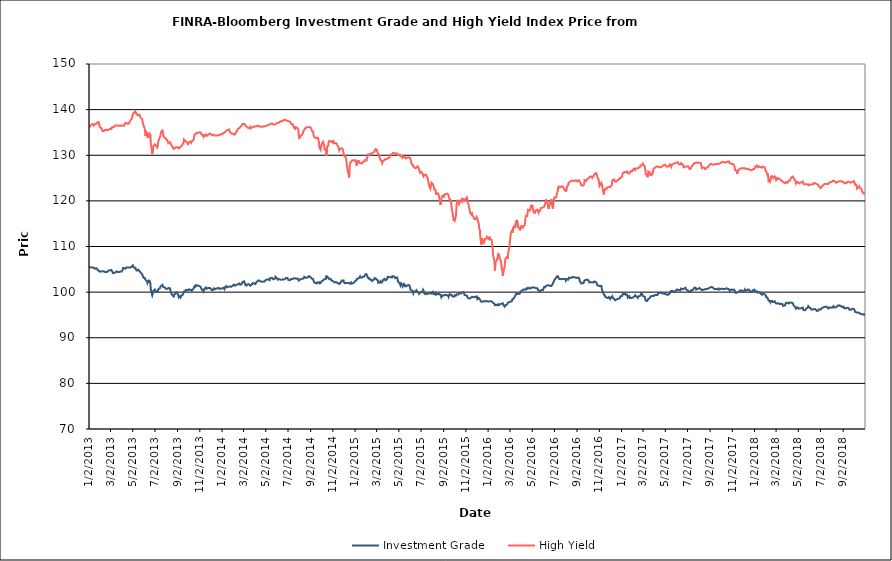
| Category | Investment Grade | High Yield |
|---|---|---|
| 1/2/13 | 105.494 | 136.004 |
| 1/3/13 | 105.419 | 136.223 |
| 1/4/13 | 105.349 | 136.418 |
| 1/7/13 | 105.428 | 136.539 |
| 1/8/13 | 105.485 | 136.567 |
| 1/9/13 | 105.45 | 136.666 |
| 1/10/13 | 105.382 | 136.791 |
| 1/11/13 | 105.347 | 136.887 |
| 1/14/13 | 105.372 | 136.76 |
| 1/15/13 | 105.348 | 136.538 |
| 1/16/13 | 105.332 | 136.64 |
| 1/17/13 | 105.127 | 136.744 |
| 1/18/13 | 105.195 | 136.872 |
| 1/22/13 | 105.239 | 136.901 |
| 1/23/13 | 105.259 | 137.065 |
| 1/24/13 | 105.154 | 137.18 |
| 1/25/13 | 104.918 | 137.344 |
| 1/28/13 | 104.671 | 137.292 |
| 1/29/13 | 104.628 | 136.915 |
| 1/30/13 | 104.462 | 136.633 |
| 1/31/13 | 104.489 | 136.183 |
| 2/1/13 | 104.509 | 136.3 |
| 2/4/13 | 104.516 | 135.996 |
| 2/5/13 | 104.38 | 135.778 |
| 2/6/13 | 104.452 | 135.607 |
| 2/7/13 | 104.557 | 135.447 |
| 2/8/13 | 104.482 | 135.313 |
| 2/11/13 | 104.548 | 135.322 |
| 2/12/13 | 104.435 | 135.393 |
| 2/13/13 | 104.331 | 135.446 |
| 2/14/13 | 104.432 | 135.524 |
| 2/15/13 | 104.394 | 135.504 |
| 2/19/13 | 104.387 | 135.572 |
| 2/20/13 | 104.348 | 135.627 |
| 2/21/13 | 104.499 | 135.402 |
| 2/22/13 | 104.557 | 135.485 |
| 2/25/13 | 104.756 | 135.664 |
| 2/26/13 | 104.841 | 135.55 |
| 2/27/13 | 104.778 | 135.597 |
| 2/28/13 | 104.777 | 135.799 |
| 3/1/13 | 104.858 | 135.684 |
| 3/4/13 | 104.85 | 135.753 |
| 3/5/13 | 104.754 | 136.111 |
| 3/6/13 | 104.599 | 136.122 |
| 3/7/13 | 104.412 | 136.133 |
| 3/8/13 | 104.18 | 136.117 |
| 3/11/13 | 104.184 | 136.2 |
| 3/12/13 | 104.331 | 136.304 |
| 3/13/13 | 104.278 | 136.283 |
| 3/14/13 | 104.276 | 136.504 |
| 3/15/13 | 104.401 | 136.543 |
| 3/18/13 | 104.535 | 136.549 |
| 3/19/13 | 104.67 | 136.561 |
| 3/20/13 | 104.466 | 136.574 |
| 3/21/13 | 104.428 | 136.487 |
| 3/22/13 | 104.404 | 136.502 |
| 3/25/13 | 104.386 | 136.448 |
| 3/26/13 | 104.316 | 136.408 |
| 3/27/13 | 104.488 | 136.442 |
| 3/28/13 | 104.489 | 136.483 |
| 4/1/13 | 104.516 | 136.479 |
| 4/2/13 | 104.463 | 136.55 |
| 4/3/13 | 104.642 | 136.537 |
| 4/4/13 | 104.92 | 136.53 |
| 4/5/13 | 105.293 | 136.496 |
| 4/8/13 | 105.29 | 136.464 |
| 4/9/13 | 105.304 | 136.717 |
| 4/10/13 | 105.125 | 136.822 |
| 4/11/13 | 105.12 | 137.05 |
| 4/12/13 | 105.316 | 137.192 |
| 4/15/13 | 105.424 | 137.038 |
| 4/16/13 | 105.369 | 137.111 |
| 4/17/13 | 105.389 | 136.936 |
| 4/18/13 | 105.407 | 136.862 |
| 4/19/13 | 105.346 | 136.955 |
| 4/22/13 | 105.406 | 137.056 |
| 4/23/13 | 105.46 | 137.317 |
| 4/24/13 | 105.498 | 137.459 |
| 4/25/13 | 105.38 | 137.639 |
| 4/26/13 | 105.595 | 137.856 |
| 4/29/13 | 105.615 | 138.038 |
| 4/30/13 | 105.612 | 138.388 |
| 5/1/13 | 105.781 | 138.733 |
| 5/2/13 | 105.844 | 138.955 |
| 5/3/13 | 105.494 | 139.201 |
| 5/6/13 | 105.353 | 139.261 |
| 5/7/13 | 105.329 | 139.46 |
| 5/8/13 | 105.359 | 139.652 |
| 5/9/13 | 105.342 | 139.604 |
| 5/10/13 | 104.923 | 139.359 |
| 5/13/13 | 104.727 | 138.947 |
| 5/14/13 | 104.694 | 138.789 |
| 5/15/13 | 104.673 | 138.724 |
| 5/16/13 | 104.927 | 138.831 |
| 5/17/13 | 104.738 | 138.852 |
| 5/20/13 | 104.621 | 138.896 |
| 5/21/13 | 104.661 | 138.85 |
| 5/22/13 | 104.462 | 138.759 |
| 5/23/13 | 104.301 | 138.269 |
| 5/24/13 | 104.298 | 138.075 |
| 5/28/13 | 103.825 | 137.844 |
| 5/29/13 | 103.525 | 137.043 |
| 5/30/13 | 103.475 | 136.973 |
| 5/31/13 | 103.159 | 136.601 |
| 6/3/13 | 103.169 | 135.944 |
| 6/4/13 | 102.987 | 135.582 |
| 6/5/13 | 102.781 | 134.538 |
| 6/6/13 | 102.788 | 134.224 |
| 6/7/13 | 102.678 | 135.191 |
| 6/10/13 | 102.314 | 134.939 |
| 6/11/13 | 101.98 | 133.85 |
| 6/12/13 | 102.018 | 134.087 |
| 6/13/13 | 102.11 | 133.805 |
| 6/14/13 | 102.545 | 134.401 |
| 6/17/13 | 102.474 | 134.746 |
| 6/18/13 | 102.164 | 134.589 |
| 6/19/13 | 101.914 | 134.457 |
| 6/20/13 | 100.588 | 132.485 |
| 6/21/13 | 100.219 | 132.116 |
| 6/24/13 | 99.311 | 130.267 |
| 6/25/13 | 99.469 | 130.422 |
| 6/26/13 | 99.857 | 131.058 |
| 6/27/13 | 100.266 | 131.995 |
| 6/28/13 | 100.357 | 132.199 |
| 7/1/13 | 100.575 | 132.38 |
| 7/2/13 | 100.774 | 132.5 |
| 7/3/13 | 100.789 | 132.233 |
| 7/5/13 | 100.052 | 132.062 |
| 7/8/13 | 100.063 | 131.702 |
| 7/9/13 | 100.261 | 131.99 |
| 7/10/13 | 100.23 | 132.194 |
| 7/11/13 | 100.65 | 133.132 |
| 7/12/13 | 100.778 | 133.422 |
| 7/15/13 | 100.866 | 133.956 |
| 7/16/13 | 101.036 | 134.184 |
| 7/17/13 | 101.286 | 134.476 |
| 7/18/13 | 101.274 | 135.077 |
| 7/19/13 | 101.435 | 135.209 |
| 7/22/13 | 101.6 | 135.45 |
| 7/23/13 | 101.546 | 135.437 |
| 7/24/13 | 101.125 | 134.763 |
| 7/25/13 | 100.927 | 134.065 |
| 7/26/13 | 101.109 | 134.013 |
| 7/29/13 | 101.003 | 133.854 |
| 7/30/13 | 100.974 | 133.888 |
| 7/31/13 | 100.761 | 133.596 |
| 8/1/13 | 100.577 | 133.583 |
| 8/2/13 | 100.839 | 133.403 |
| 8/5/13 | 100.724 | 133.206 |
| 8/6/13 | 100.666 | 132.905 |
| 8/7/13 | 100.771 | 132.644 |
| 8/8/13 | 100.906 | 132.743 |
| 8/9/13 | 100.882 | 132.811 |
| 8/12/13 | 100.814 | 132.845 |
| 8/13/13 | 100.327 | 132.628 |
| 8/14/13 | 100.232 | 132.676 |
| 8/15/13 | 99.756 | 132.339 |
| 8/16/13 | 99.565 | 132.204 |
| 8/19/13 | 99.254 | 131.767 |
| 8/20/13 | 99.406 | 131.634 |
| 8/21/13 | 99.234 | 131.571 |
| 8/22/13 | 99.051 | 131.404 |
| 8/23/13 | 99.367 | 131.617 |
| 8/26/13 | 99.636 | 131.681 |
| 8/27/13 | 99.89 | 131.589 |
| 8/28/13 | 99.751 | 131.599 |
| 8/29/13 | 99.819 | 131.721 |
| 8/30/13 | 99.969 | 131.931 |
| 9/3/13 | 99.443 | 131.767 |
| 9/4/13 | 99.4 | 131.735 |
| 9/5/13 | 98.833 | 131.503 |
| 9/6/13 | 99.036 | 131.534 |
| 9/9/13 | 99.126 | 131.762 |
| 9/10/13 | 98.881 | 131.688 |
| 9/11/13 | 98.985 | 131.774 |
| 9/12/13 | 99.199 | 132.012 |
| 9/13/13 | 99.132 | 132.108 |
| 9/16/13 | 99.445 | 132.49 |
| 9/17/13 | 99.387 | 132.526 |
| 9/18/13 | 99.587 | 132.801 |
| 9/19/13 | 100.13 | 133.454 |
| 9/20/13 | 100.145 | 133.463 |
| 9/23/13 | 100.222 | 133.158 |
| 9/24/13 | 100.458 | 133.178 |
| 9/25/13 | 100.57 | 133.037 |
| 9/26/13 | 100.459 | 132.947 |
| 9/27/13 | 100.477 | 132.761 |
| 9/30/13 | 100.36 | 132.403 |
| 10/1/13 | 100.351 | 132.559 |
| 10/2/13 | 100.5 | 132.65 |
| 10/3/13 | 100.614 | 132.895 |
| 10/4/13 | 100.436 | 132.974 |
| 10/7/13 | 100.499 | 133.004 |
| 10/8/13 | 100.458 | 132.84 |
| 10/9/13 | 100.359 | 132.765 |
| 10/10/13 | 100.309 | 133.012 |
| 10/11/13 | 100.536 | 133.183 |
| 10/14/13 | 100.578 | 133.263 |
| 10/15/13 | 100.404 | 133.285 |
| 10/16/13 | 100.541 | 133.539 |
| 10/17/13 | 101.066 | 134.085 |
| 10/18/13 | 101.3 | 134.484 |
| 10/21/13 | 101.202 | 134.622 |
| 10/22/13 | 101.507 | 134.843 |
| 10/23/13 | 101.575 | 134.752 |
| 10/24/13 | 101.454 | 134.8 |
| 10/25/13 | 101.475 | 134.836 |
| 10/28/13 | 101.432 | 134.984 |
| 10/29/13 | 101.425 | 134.988 |
| 10/30/13 | 101.524 | 135.037 |
| 10/31/13 | 101.352 | 135.022 |
| 11/1/13 | 101.143 | 134.905 |
| 11/4/13 | 101.125 | 135.008 |
| 11/5/13 | 100.846 | 134.753 |
| 11/6/13 | 100.906 | 134.761 |
| 11/7/13 | 100.99 | 134.746 |
| 11/8/13 | 100.473 | 134.373 |
| 11/11/13 | 100.506 | 134.437 |
| 11/12/13 | 100.257 | 134.002 |
| 11/13/13 | 100.423 | 133.829 |
| 11/14/13 | 100.717 | 134.11 |
| 11/15/13 | 100.772 | 134.271 |
| 11/18/13 | 101.031 | 134.561 |
| 11/19/13 | 100.928 | 134.495 |
| 11/20/13 | 100.749 | 134.418 |
| 11/21/13 | 100.578 | 134.251 |
| 11/22/13 | 100.784 | 134.462 |
| 11/25/13 | 100.926 | 134.532 |
| 11/26/13 | 101.066 | 134.489 |
| 11/27/13 | 100.968 | 134.694 |
| 11/29/13 | 100.926 | 134.769 |
| 12/2/13 | 100.715 | 134.59 |
| 12/3/13 | 100.783 | 134.592 |
| 12/4/13 | 100.522 | 134.448 |
| 12/5/13 | 100.422 | 134.378 |
| 12/6/13 | 100.434 | 134.486 |
| 12/9/13 | 100.55 | 134.531 |
| 12/10/13 | 100.804 | 134.606 |
| 12/11/13 | 100.783 | 134.549 |
| 12/12/13 | 100.616 | 134.316 |
| 12/13/13 | 100.656 | 134.34 |
| 12/16/13 | 100.77 | 134.355 |
| 12/17/13 | 100.883 | 134.318 |
| 12/18/13 | 100.862 | 134.256 |
| 12/19/13 | 100.784 | 134.28 |
| 12/20/13 | 100.91 | 134.382 |
| 12/23/13 | 100.94 | 134.459 |
| 12/24/13 | 100.826 | 134.433 |
| 12/26/13 | 100.715 | 134.462 |
| 12/27/13 | 100.661 | 134.544 |
| 12/30/13 | 100.78 | 134.644 |
| 12/31/13 | 100.835 | 134.665 |
| 1/2/14 | 100.818 | 134.61 |
| 1/3/14 | 100.821 | 134.675 |
| 1/6/14 | 100.947 | 134.841 |
| 1/7/14 | 100.979 | 135.053 |
| 1/8/14 | 100.662 | 135.04 |
| 1/9/14 | 100.703 | 135.072 |
| 1/10/14 | 101.104 | 135.228 |
| 1/13/14 | 101.302 | 135.332 |
| 1/14/14 | 101.168 | 135.33 |
| 1/15/14 | 101.05 | 135.493 |
| 1/16/14 | 101.186 | 135.513 |
| 1/17/14 | 101.214 | 135.694 |
| 1/21/14 | 101.237 | 135.657 |
| 1/22/14 | 101.077 | 135.696 |
| 1/23/14 | 101.165 | 135.526 |
| 1/24/14 | 101.225 | 135.025 |
| 1/27/14 | 101.165 | 134.766 |
| 1/28/14 | 101.185 | 134.798 |
| 1/29/14 | 101.336 | 134.736 |
| 1/30/14 | 101.366 | 134.782 |
| 1/31/14 | 101.431 | 134.664 |
| 2/3/14 | 101.636 | 134.541 |
| 2/4/14 | 101.583 | 134.457 |
| 2/5/14 | 101.42 | 134.361 |
| 2/6/14 | 101.393 | 134.536 |
| 2/7/14 | 101.592 | 134.888 |
| 2/10/14 | 101.615 | 135.076 |
| 2/11/14 | 101.498 | 135.216 |
| 2/12/14 | 101.418 | 135.441 |
| 2/13/14 | 101.69 | 135.543 |
| 2/14/14 | 101.753 | 135.746 |
| 2/18/14 | 101.892 | 135.952 |
| 2/19/14 | 101.879 | 136.044 |
| 2/20/14 | 101.613 | 136.097 |
| 2/21/14 | 101.699 | 136.258 |
| 2/24/14 | 101.732 | 136.482 |
| 2/25/14 | 101.989 | 136.691 |
| 2/26/14 | 102.079 | 136.809 |
| 2/27/14 | 102.222 | 136.918 |
| 2/28/14 | 102.211 | 137.009 |
| 3/3/14 | 102.364 | 136.884 |
| 3/4/14 | 102.118 | 136.915 |
| 3/5/14 | 102.048 | 136.916 |
| 3/6/14 | 101.816 | 136.684 |
| 3/7/14 | 101.497 | 136.459 |
| 3/10/14 | 101.461 | 136.253 |
| 3/11/14 | 101.46 | 136.252 |
| 3/12/14 | 101.557 | 136.142 |
| 3/13/14 | 101.718 | 136.026 |
| 3/14/14 | 101.769 | 135.809 |
| 3/17/14 | 101.717 | 135.965 |
| 3/18/14 | 101.749 | 136.072 |
| 3/19/14 | 101.649 | 136.191 |
| 3/20/14 | 101.412 | 135.875 |
| 3/21/14 | 101.566 | 136.086 |
| 3/24/14 | 101.667 | 136.015 |
| 3/25/14 | 101.737 | 136.04 |
| 3/26/14 | 101.878 | 136.252 |
| 3/27/14 | 101.987 | 136.119 |
| 3/28/14 | 101.878 | 136.233 |
| 3/31/14 | 101.852 | 136.266 |
| 4/1/14 | 101.868 | 136.261 |
| 4/2/14 | 101.643 | 136.321 |
| 4/3/14 | 101.764 | 136.337 |
| 4/4/14 | 102.025 | 136.448 |
| 4/7/14 | 102.21 | 136.349 |
| 4/8/14 | 102.242 | 136.393 |
| 4/9/14 | 102.266 | 136.486 |
| 4/10/14 | 102.532 | 136.521 |
| 4/11/14 | 102.573 | 136.311 |
| 4/14/14 | 102.531 | 136.308 |
| 4/15/14 | 102.544 | 136.227 |
| 4/16/14 | 102.487 | 136.253 |
| 4/17/14 | 102.346 | 136.257 |
| 4/21/14 | 102.277 | 136.247 |
| 4/22/14 | 102.207 | 136.279 |
| 4/23/14 | 102.343 | 136.332 |
| 4/24/14 | 102.303 | 136.334 |
| 4/25/14 | 102.421 | 136.355 |
| 4/28/14 | 102.328 | 136.308 |
| 4/29/14 | 102.243 | 136.341 |
| 4/30/14 | 102.413 | 136.464 |
| 5/1/14 | 102.654 | 136.42 |
| 5/2/14 | 102.735 | 136.585 |
| 5/5/14 | 102.752 | 136.518 |
| 5/6/14 | 102.75 | 136.554 |
| 5/7/14 | 102.757 | 136.59 |
| 5/8/14 | 102.825 | 136.629 |
| 5/9/14 | 102.765 | 136.738 |
| 5/12/14 | 102.608 | 136.757 |
| 5/13/14 | 102.76 | 136.86 |
| 5/14/14 | 103.095 | 136.951 |
| 5/15/14 | 103.233 | 136.892 |
| 5/16/14 | 103.154 | 136.848 |
| 5/19/14 | 103.118 | 136.968 |
| 5/20/14 | 103.068 | 136.874 |
| 5/21/14 | 102.909 | 136.849 |
| 5/22/14 | 102.817 | 136.739 |
| 5/23/14 | 102.956 | 136.771 |
| 5/27/14 | 102.996 | 136.726 |
| 5/28/14 | 103.368 | 136.78 |
| 5/29/14 | 103.4 | 136.844 |
| 5/30/14 | 103.25 | 136.989 |
| 6/2/14 | 102.997 | 137.03 |
| 6/3/14 | 102.747 | 136.843 |
| 6/4/14 | 102.639 | 136.861 |
| 6/5/14 | 102.724 | 137.095 |
| 6/6/14 | 102.858 | 137.239 |
| 6/9/14 | 102.774 | 137.321 |
| 6/10/14 | 102.652 | 137.409 |
| 6/11/14 | 102.666 | 137.46 |
| 6/12/14 | 102.706 | 137.448 |
| 6/13/14 | 102.744 | 137.427 |
| 6/16/14 | 102.763 | 137.473 |
| 6/17/14 | 102.566 | 137.403 |
| 6/18/14 | 102.647 | 137.424 |
| 6/19/14 | 102.775 | 137.698 |
| 6/20/14 | 102.697 | 137.723 |
| 6/23/14 | 102.846 | 137.779 |
| 6/24/14 | 102.88 | 137.797 |
| 6/25/14 | 103.059 | 137.699 |
| 6/26/14 | 103.117 | 137.613 |
| 6/27/14 | 103.111 | 137.582 |
| 6/30/14 | 103.096 | 137.543 |
| 7/1/14 | 102.92 | 137.521 |
| 7/2/14 | 102.692 | 137.487 |
| 7/3/14 | 102.53 | 137.445 |
| 7/7/14 | 102.607 | 137.369 |
| 7/8/14 | 102.82 | 137.259 |
| 7/9/14 | 102.778 | 137.102 |
| 7/10/14 | 102.892 | 136.873 |
| 7/11/14 | 102.97 | 136.858 |
| 7/14/14 | 102.883 | 136.783 |
| 7/15/14 | 102.808 | 136.662 |
| 7/16/14 | 102.837 | 136.489 |
| 7/17/14 | 103.023 | 136.093 |
| 7/18/14 | 102.976 | 135.884 |
| 7/21/14 | 103.018 | 135.786 |
| 7/22/14 | 103.027 | 135.911 |
| 7/23/14 | 103.133 | 136.146 |
| 7/24/14 | 102.926 | 136.135 |
| 7/25/14 | 103.053 | 136.103 |
| 7/28/14 | 103.005 | 135.916 |
| 7/29/14 | 103.084 | 135.842 |
| 7/30/14 | 102.775 | 135.555 |
| 7/31/14 | 102.536 | 134.442 |
| 8/1/14 | 102.65 | 133.751 |
| 8/4/14 | 102.794 | 133.906 |
| 8/5/14 | 102.693 | 134.262 |
| 8/6/14 | 102.743 | 134.202 |
| 8/7/14 | 102.903 | 134.308 |
| 8/8/14 | 103.015 | 134.39 |
| 8/11/14 | 102.911 | 134.76 |
| 8/12/14 | 102.848 | 134.962 |
| 8/13/14 | 102.947 | 135.352 |
| 8/14/14 | 103.093 | 135.465 |
| 8/15/14 | 103.336 | 135.579 |
| 8/18/14 | 103.224 | 135.868 |
| 8/19/14 | 103.166 | 136.06 |
| 8/20/14 | 103.049 | 136.102 |
| 8/21/14 | 103.116 | 136.129 |
| 8/22/14 | 103.16 | 136.109 |
| 8/25/14 | 103.266 | 136.118 |
| 8/26/14 | 103.305 | 136.212 |
| 8/27/14 | 103.386 | 136.164 |
| 8/28/14 | 103.533 | 136.214 |
| 8/29/14 | 103.569 | 136.23 |
| 9/2/14 | 103.224 | 136.057 |
| 9/3/14 | 103.152 | 135.89 |
| 9/4/14 | 102.992 | 135.641 |
| 9/5/14 | 102.979 | 135.338 |
| 9/8/14 | 102.91 | 135.188 |
| 9/9/14 | 102.636 | 134.826 |
| 9/10/14 | 102.415 | 134.318 |
| 9/11/14 | 102.404 | 134.077 |
| 9/12/14 | 102.066 | 133.947 |
| 9/15/14 | 102.058 | 133.746 |
| 9/16/14 | 102.079 | 133.58 |
| 9/17/14 | 102.06 | 133.729 |
| 9/18/14 | 101.895 | 133.842 |
| 9/19/14 | 102.051 | 133.984 |
| 9/22/14 | 102.194 | 133.817 |
| 9/23/14 | 102.265 | 133.321 |
| 9/24/14 | 102.135 | 133.064 |
| 9/25/14 | 102.162 | 132.238 |
| 9/26/14 | 101.911 | 131.656 |
| 9/29/14 | 101.987 | 131.223 |
| 9/30/14 | 101.995 | 131.89 |
| 10/1/14 | 102.349 | 132.149 |
| 10/2/14 | 102.373 | 132.201 |
| 10/3/14 | 102.345 | 132.64 |
| 10/6/14 | 102.56 | 132.946 |
| 10/7/14 | 102.76 | 132.603 |
| 10/8/14 | 102.816 | 132.383 |
| 10/9/14 | 102.873 | 131.878 |
| 10/10/14 | 102.843 | 131.266 |
| 10/13/14 | 102.861 | 131.314 |
| 10/14/14 | 103.153 | 130.54 |
| 10/15/14 | 103.63 | 129.86 |
| 10/16/14 | 103.21 | 130.301 |
| 10/17/14 | 103.149 | 132.001 |
| 10/20/14 | 103.206 | 132.057 |
| 10/21/14 | 103.156 | 132.922 |
| 10/22/14 | 103.063 | 133.044 |
| 10/23/14 | 102.823 | 133.165 |
| 10/24/14 | 102.843 | 133.183 |
| 10/27/14 | 102.852 | 132.995 |
| 10/28/14 | 102.764 | 133.102 |
| 10/29/14 | 102.545 | 132.948 |
| 10/30/14 | 102.596 | 132.859 |
| 10/31/14 | 102.445 | 133.107 |
| 11/3/14 | 102.344 | 133.133 |
| 11/4/14 | 102.35 | 132.642 |
| 11/5/14 | 102.221 | 132.701 |
| 11/6/14 | 102.127 | 132.705 |
| 11/7/14 | 102.255 | 132.638 |
| 11/10/14 | 102.218 | 132.691 |
| 11/11/14 | 102.225 | 132.81 |
| 11/12/14 | 102.112 | 132.619 |
| 11/13/14 | 102.052 | 132.412 |
| 11/14/14 | 102.008 | 132.145 |
| 11/17/14 | 101.894 | 131.772 |
| 11/18/14 | 101.843 | 131.427 |
| 11/19/14 | 101.695 | 131.083 |
| 11/20/14 | 101.809 | 131.09 |
| 11/21/14 | 102.03 | 131.414 |
| 11/24/14 | 102.171 | 131.531 |
| 11/25/14 | 102.338 | 131.588 |
| 11/26/14 | 102.539 | 131.644 |
| 11/28/14 | 102.655 | 131.425 |
| 12/1/14 | 102.559 | 130.466 |
| 12/2/14 | 102.141 | 129.983 |
| 12/3/14 | 102.081 | 130.038 |
| 12/4/14 | 102.177 | 129.993 |
| 12/5/14 | 101.947 | 129.782 |
| 12/8/14 | 101.994 | 129.233 |
| 12/9/14 | 102.101 | 128.353 |
| 12/10/14 | 102.099 | 127.663 |
| 12/11/14 | 102.021 | 127.356 |
| 12/12/14 | 102.212 | 126.57 |
| 12/15/14 | 101.978 | 125.84 |
| 12/16/14 | 101.885 | 125.12 |
| 12/17/14 | 101.994 | 126.235 |
| 12/18/14 | 101.843 | 127.8 |
| 12/19/14 | 102.027 | 128.272 |
| 12/22/14 | 102.137 | 128.584 |
| 12/23/14 | 102.011 | 128.794 |
| 12/24/14 | 101.848 | 128.833 |
| 12/26/14 | 101.905 | 128.825 |
| 12/29/14 | 102.054 | 128.921 |
| 12/30/14 | 102.239 | 128.765 |
| 12/31/14 | 102.233 | 128.769 |
| 1/2/15 | 102.426 | 128.911 |
| 1/5/15 | 102.586 | 128.223 |
| 1/6/15 | 102.878 | 127.662 |
| 1/7/15 | 102.893 | 128.095 |
| 1/8/15 | 102.797 | 128.789 |
| 1/9/15 | 102.956 | 128.868 |
| 1/12/15 | 103.094 | 128.728 |
| 1/13/15 | 103.116 | 128.583 |
| 1/14/15 | 103.282 | 128.28 |
| 1/15/15 | 103.445 | 128.444 |
| 1/16/15 | 103.218 | 128.331 |
| 1/20/15 | 103.176 | 128.203 |
| 1/21/15 | 103.074 | 128.203 |
| 1/22/15 | 102.998 | 128.455 |
| 1/23/15 | 103.395 | 128.628 |
| 1/26/15 | 103.388 | 128.595 |
| 1/27/15 | 103.486 | 128.767 |
| 1/28/15 | 103.616 | 128.923 |
| 1/29/15 | 103.575 | 128.896 |
| 1/30/15 | 103.915 | 128.884 |
| 2/2/15 | 103.902 | 128.826 |
| 2/3/15 | 103.611 | 129.307 |
| 2/4/15 | 103.464 | 129.573 |
| 2/5/15 | 103.571 | 129.826 |
| 2/6/15 | 103.134 | 130.204 |
| 2/9/15 | 103.034 | 130.169 |
| 2/10/15 | 102.809 | 130.199 |
| 2/11/15 | 102.739 | 130.053 |
| 2/12/15 | 102.846 | 130.105 |
| 2/13/15 | 102.803 | 130.334 |
| 2/17/15 | 102.437 | 130.465 |
| 2/18/15 | 102.543 | 130.673 |
| 2/19/15 | 102.623 | 130.581 |
| 2/20/15 | 102.701 | 130.602 |
| 2/23/15 | 102.76 | 130.717 |
| 2/24/15 | 103.054 | 130.904 |
| 2/25/15 | 103.205 | 131.093 |
| 2/26/15 | 103.084 | 131.259 |
| 2/27/15 | 103.014 | 131.346 |
| 3/2/15 | 102.766 | 131.232 |
| 3/3/15 | 102.641 | 131.019 |
| 3/4/15 | 102.55 | 130.662 |
| 3/5/15 | 102.571 | 130.64 |
| 3/6/15 | 102.05 | 130.229 |
| 3/9/15 | 102.107 | 129.958 |
| 3/10/15 | 102.236 | 129.348 |
| 3/11/15 | 102.218 | 129.308 |
| 3/12/15 | 102.373 | 129.437 |
| 3/13/15 | 102.12 | 128.915 |
| 3/16/15 | 102.092 | 128.692 |
| 3/17/15 | 102.088 | 128.301 |
| 3/18/15 | 102.392 | 128.399 |
| 3/19/15 | 102.637 | 128.765 |
| 3/20/15 | 102.778 | 128.818 |
| 3/23/15 | 102.9 | 128.891 |
| 3/24/15 | 103.067 | 129.136 |
| 3/25/15 | 102.948 | 129.155 |
| 3/26/15 | 102.572 | 129.012 |
| 3/27/15 | 102.722 | 129.135 |
| 3/30/15 | 102.816 | 129.18 |
| 3/31/15 | 102.97 | 129.203 |
| 4/1/15 | 103.346 | 129.242 |
| 4/2/15 | 103.283 | 129.384 |
| 4/6/15 | 103.281 | 129.514 |
| 4/7/15 | 103.339 | 129.813 |
| 4/8/15 | 103.385 | 130.12 |
| 4/9/15 | 103.25 | 130.08 |
| 4/10/15 | 103.269 | 130.183 |
| 4/13/15 | 103.225 | 130.222 |
| 4/14/15 | 103.502 | 130.217 |
| 4/15/15 | 103.476 | 130.43 |
| 4/16/15 | 103.412 | 130.52 |
| 4/17/15 | 103.448 | 130.393 |
| 4/20/15 | 103.374 | 130.451 |
| 4/21/15 | 103.344 | 130.415 |
| 4/22/15 | 103.073 | 130.258 |
| 4/23/15 | 103.075 | 130.272 |
| 4/24/15 | 103.252 | 130.37 |
| 4/27/15 | 103.2 | 130.372 |
| 4/28/15 | 102.95 | 130.305 |
| 4/29/15 | 102.411 | 130.069 |
| 4/30/15 | 102.251 | 129.999 |
| 5/1/15 | 102.081 | 130.001 |
| 5/4/15 | 101.991 | 130.107 |
| 5/5/15 | 101.745 | 130.012 |
| 5/6/15 | 101.469 | 129.725 |
| 5/7/15 | 101.552 | 129.512 |
| 5/8/15 | 101.879 | 129.87 |
| 5/11/15 | 101.525 | 129.898 |
| 5/12/15 | 101.269 | 129.438 |
| 5/13/15 | 101.316 | 129.534 |
| 5/14/15 | 101.397 | 129.569 |
| 5/15/15 | 101.81 | 129.716 |
| 5/18/15 | 101.582 | 129.614 |
| 5/19/15 | 101.262 | 129.456 |
| 5/20/15 | 101.187 | 129.294 |
| 5/21/15 | 101.333 | 129.372 |
| 5/22/15 | 101.31 | 129.503 |
| 5/26/15 | 101.519 | 129.524 |
| 5/27/15 | 101.506 | 129.504 |
| 5/28/15 | 101.507 | 129.417 |
| 5/29/15 | 101.544 | 129.539 |
| 6/1/15 | 101.222 | 129.422 |
| 6/2/15 | 100.801 | 129.253 |
| 6/3/15 | 100.493 | 128.955 |
| 6/4/15 | 100.607 | 128.669 |
| 6/5/15 | 100.338 | 128.185 |
| 6/8/15 | 100.328 | 127.981 |
| 6/9/15 | 100.063 | 127.603 |
| 6/10/15 | 99.766 | 127.441 |
| 6/11/15 | 100.019 | 127.722 |
| 6/12/15 | 100.209 | 127.509 |
| 6/15/15 | 100.183 | 127.18 |
| 6/16/15 | 100.204 | 127.036 |
| 6/17/15 | 100.102 | 127.086 |
| 6/18/15 | 100.13 | 127.235 |
| 6/19/15 | 100.39 | 127.422 |
| 6/22/15 | 100.096 | 127.586 |
| 6/23/15 | 99.909 | 127.511 |
| 6/24/15 | 99.918 | 127.359 |
| 6/25/15 | 99.854 | 127.195 |
| 6/26/15 | 99.62 | 126.893 |
| 6/29/15 | 99.884 | 126.158 |
| 6/30/15 | 100.037 | 126.2 |
| 7/1/15 | 99.808 | 126.273 |
| 7/2/15 | 99.959 | 126.354 |
| 7/6/15 | 100.232 | 125.966 |
| 7/7/15 | 100.504 | 125.596 |
| 7/8/15 | 100.46 | 125.367 |
| 7/9/15 | 100.206 | 125.508 |
| 7/10/15 | 99.759 | 125.61 |
| 7/13/15 | 99.543 | 125.751 |
| 7/14/15 | 99.576 | 125.717 |
| 7/15/15 | 99.661 | 125.833 |
| 7/16/15 | 99.721 | 125.742 |
| 7/17/15 | 99.787 | 125.286 |
| 7/20/15 | 99.6 | 124.999 |
| 7/21/15 | 99.649 | 124.522 |
| 7/22/15 | 99.72 | 123.795 |
| 7/23/15 | 99.744 | 123.523 |
| 7/24/15 | 99.803 | 123.3 |
| 7/27/15 | 99.786 | 122.67 |
| 7/28/15 | 99.739 | 122.649 |
| 7/29/15 | 99.618 | 123.461 |
| 7/30/15 | 99.685 | 123.964 |
| 7/31/15 | 99.954 | 123.922 |
| 8/3/15 | 100.094 | 123.653 |
| 8/4/15 | 99.962 | 123.719 |
| 8/5/15 | 99.584 | 123.491 |
| 8/6/15 | 99.586 | 122.954 |
| 8/7/15 | 99.668 | 122.503 |
| 8/10/15 | 99.471 | 122.46 |
| 8/11/15 | 99.769 | 121.721 |
| 8/12/15 | 99.692 | 121.342 |
| 8/13/15 | 99.468 | 121.66 |
| 8/14/15 | 99.448 | 121.642 |
| 8/17/15 | 99.602 | 121.654 |
| 8/18/15 | 99.477 | 121.633 |
| 8/19/15 | 99.424 | 121.252 |
| 8/20/15 | 99.586 | 120.824 |
| 8/21/15 | 99.626 | 120.461 |
| 8/24/15 | 99.414 | 119.113 |
| 8/25/15 | 99.195 | 119.971 |
| 8/26/15 | 98.899 | 119.946 |
| 8/27/15 | 99.074 | 120.628 |
| 8/28/15 | 99.244 | 120.939 |
| 8/31/15 | 99.217 | 121.131 |
| 9/1/15 | 99.152 | 120.781 |
| 9/2/15 | 99.203 | 120.942 |
| 9/3/15 | 99.347 | 121.372 |
| 9/4/15 | 99.526 | 121.243 |
| 9/8/15 | 99.36 | 121.524 |
| 9/9/15 | 99.315 | 121.732 |
| 9/10/15 | 99.219 | 121.563 |
| 9/11/15 | 99.299 | 121.587 |
| 9/14/15 | 99.28 | 121.4 |
| 9/15/15 | 98.987 | 121.19 |
| 9/16/15 | 98.862 | 120.73 |
| 9/17/15 | 99.061 | 120.585 |
| 9/18/15 | 99.563 | 120.333 |
| 9/21/15 | 99.399 | 120.151 |
| 9/22/15 | 99.494 | 119.36 |
| 9/23/15 | 99.371 | 119.122 |
| 9/24/15 | 99.35 | 118.157 |
| 9/25/15 | 99.1 | 117.905 |
| 9/28/15 | 99.012 | 116.226 |
| 9/29/15 | 98.984 | 115.614 |
| 9/30/15 | 99.07 | 116.002 |
| 10/1/15 | 99.06 | 115.948 |
| 10/2/15 | 99.323 | 115.684 |
| 10/5/15 | 99.23 | 116.623 |
| 10/6/15 | 99.352 | 117.736 |
| 10/7/15 | 99.51 | 119.116 |
| 10/8/15 | 99.412 | 119.115 |
| 10/9/15 | 99.403 | 120.047 |
| 10/12/15 | 99.475 | 120.06 |
| 10/13/15 | 99.568 | 119.722 |
| 10/14/15 | 99.799 | 119.376 |
| 10/15/15 | 99.747 | 119.342 |
| 10/16/15 | 99.774 | 119.841 |
| 10/19/15 | 99.716 | 119.878 |
| 10/20/15 | 99.599 | 120.046 |
| 10/21/15 | 99.843 | 120.27 |
| 10/22/15 | 99.962 | 120.041 |
| 10/23/15 | 99.839 | 120.443 |
| 10/26/15 | 99.988 | 120.39 |
| 10/27/15 | 100.024 | 120.083 |
| 10/28/15 | 99.784 | 120.133 |
| 10/29/15 | 99.366 | 120.237 |
| 10/30/15 | 99.366 | 120.195 |
| 11/2/15 | 99.31 | 120.487 |
| 11/3/15 | 99.232 | 120.637 |
| 11/4/15 | 99.181 | 120.753 |
| 11/5/15 | 99.133 | 120.502 |
| 11/6/15 | 98.802 | 119.883 |
| 11/9/15 | 98.639 | 119.13 |
| 11/10/15 | 98.69 | 118.692 |
| 11/11/15 | 98.74 | 118.736 |
| 11/12/15 | 98.611 | 118.014 |
| 11/13/15 | 98.747 | 117.394 |
| 11/16/15 | 98.823 | 117.075 |
| 11/17/15 | 98.766 | 117.548 |
| 11/18/15 | 98.769 | 117.423 |
| 11/19/15 | 98.972 | 116.89 |
| 11/20/15 | 98.935 | 116.829 |
| 11/23/15 | 98.87 | 116.393 |
| 11/24/15 | 98.906 | 116.043 |
| 11/25/15 | 98.93 | 116.051 |
| 11/27/15 | 98.976 | 115.977 |
| 11/30/15 | 98.929 | 116.132 |
| 12/1/15 | 99.197 | 116.463 |
| 12/2/15 | 99.116 | 116.678 |
| 12/3/15 | 98.476 | 116.209 |
| 12/4/15 | 98.55 | 115.723 |
| 12/7/15 | 98.714 | 114.95 |
| 12/8/15 | 98.535 | 113.929 |
| 12/9/15 | 98.493 | 113.937 |
| 12/10/15 | 98.415 | 113.616 |
| 12/11/15 | 98.408 | 112.053 |
| 12/14/15 | 97.875 | 110.398 |
| 12/15/15 | 97.724 | 111.331 |
| 12/16/15 | 97.692 | 111.756 |
| 12/17/15 | 97.923 | 111.719 |
| 12/18/15 | 98.016 | 110.876 |
| 12/21/15 | 98.036 | 110.761 |
| 12/22/15 | 97.906 | 111.06 |
| 12/23/15 | 97.884 | 111.633 |
| 12/24/15 | 97.951 | 111.817 |
| 12/28/15 | 98.048 | 111.751 |
| 12/29/15 | 97.858 | 112.132 |
| 12/30/15 | 97.834 | 112.194 |
| 12/31/15 | 97.954 | 112.164 |
| 1/4/16 | 97.954 | 111.61 |
| 1/5/16 | 97.883 | 112.157 |
| 1/6/16 | 98.075 | 112.146 |
| 1/7/16 | 98.019 | 111.674 |
| 1/8/16 | 98.141 | 111.833 |
| 1/11/16 | 97.966 | 111.469 |
| 1/12/16 | 97.968 | 111.045 |
| 1/13/16 | 97.973 | 110.498 |
| 1/14/16 | 97.726 | 109.605 |
| 1/15/16 | 97.656 | 108.22 |
| 1/19/16 | 97.422 | 106.701 |
| 1/20/16 | 97.151 | 104.751 |
| 1/21/16 | 97.215 | 105.29 |
| 1/22/16 | 97.163 | 106.657 |
| 1/25/16 | 97.159 | 106.911 |
| 1/26/16 | 97.197 | 107.204 |
| 1/27/16 | 97.048 | 107.442 |
| 1/28/16 | 97.129 | 107.959 |
| 1/29/16 | 97.357 | 108.363 |
| 2/1/16 | 97.19 | 108.18 |
| 2/2/16 | 97.337 | 107.497 |
| 2/3/16 | 97.327 | 107.249 |
| 2/4/16 | 97.387 | 107.393 |
| 2/5/16 | 97.392 | 106.952 |
| 2/8/16 | 97.497 | 105.276 |
| 2/9/16 | 97.38 | 104.63 |
| 2/10/16 | 97.494 | 105 |
| 2/11/16 | 97.536 | 103.609 |
| 2/12/16 | 97.221 | 104.265 |
| 2/16/16 | 96.823 | 105.687 |
| 2/17/16 | 96.752 | 106.697 |
| 2/18/16 | 97.125 | 107.321 |
| 2/19/16 | 97.184 | 107.105 |
| 2/22/16 | 97.277 | 107.702 |
| 2/23/16 | 97.403 | 107.614 |
| 2/24/16 | 97.493 | 107.304 |
| 2/25/16 | 97.671 | 107.935 |
| 2/26/16 | 97.635 | 108.879 |
| 2/29/16 | 97.849 | 109.804 |
| 3/1/16 | 97.704 | 110.942 |
| 3/2/16 | 97.698 | 111.706 |
| 3/3/16 | 97.916 | 112.167 |
| 3/4/16 | 97.913 | 113.082 |
| 3/7/16 | 98.053 | 113.458 |
| 3/8/16 | 98.473 | 112.986 |
| 3/9/16 | 98.318 | 112.846 |
| 3/10/16 | 98.368 | 113.184 |
| 3/11/16 | 98.541 | 114.211 |
| 3/14/16 | 98.884 | 114.51 |
| 3/15/16 | 98.904 | 114.043 |
| 3/16/16 | 98.905 | 113.864 |
| 3/17/16 | 99.356 | 114.716 |
| 3/18/16 | 99.586 | 115.523 |
| 3/21/16 | 99.581 | 115.663 |
| 3/22/16 | 99.59 | 115.435 |
| 3/23/16 | 99.727 | 115.115 |
| 3/24/16 | 99.659 | 114.191 |
| 3/28/16 | 99.666 | 113.974 |
| 3/29/16 | 99.821 | 113.52 |
| 3/30/16 | 99.914 | 114.159 |
| 3/31/16 | 100.16 | 114.42 |
| 4/1/16 | 100.239 | 114.414 |
| 4/4/16 | 100.344 | 114.445 |
| 4/5/16 | 100.51 | 113.977 |
| 4/6/16 | 100.402 | 114.326 |
| 4/7/16 | 100.595 | 114.184 |
| 4/8/16 | 100.553 | 114.388 |
| 4/11/16 | 100.536 | 114.726 |
| 4/12/16 | 100.422 | 115.276 |
| 4/13/16 | 100.523 | 116.313 |
| 4/14/16 | 100.553 | 116.732 |
| 4/15/16 | 100.795 | 116.767 |
| 4/18/16 | 100.717 | 116.694 |
| 4/19/16 | 100.914 | 117.525 |
| 4/20/16 | 100.969 | 118.048 |
| 4/21/16 | 100.831 | 118.202 |
| 4/22/16 | 100.819 | 118.149 |
| 4/25/16 | 100.752 | 117.862 |
| 4/26/16 | 100.613 | 118.006 |
| 4/27/16 | 100.75 | 118.405 |
| 4/28/16 | 100.971 | 118.933 |
| 4/29/16 | 101.057 | 118.977 |
| 5/2/16 | 100.972 | 118.989 |
| 5/3/16 | 101.105 | 118.358 |
| 5/4/16 | 100.988 | 118 |
| 5/5/16 | 101.081 | 117.869 |
| 5/6/16 | 100.977 | 117.444 |
| 5/9/16 | 100.928 | 117.376 |
| 5/10/16 | 100.974 | 117.498 |
| 5/11/16 | 101.032 | 117.891 |
| 5/12/16 | 100.877 | 118.018 |
| 5/13/16 | 100.95 | 117.876 |
| 5/16/16 | 100.827 | 118.086 |
| 5/17/16 | 100.809 | 118.204 |
| 5/18/16 | 100.373 | 118.032 |
| 5/19/16 | 100.166 | 117.415 |
| 5/20/16 | 100.176 | 117.792 |
| 5/23/16 | 100.188 | 117.807 |
| 5/24/16 | 100.101 | 117.977 |
| 5/25/16 | 100.192 | 118.409 |
| 5/26/16 | 100.45 | 118.541 |
| 5/27/16 | 100.506 | 118.585 |
| 5/31/16 | 100.47 | 118.559 |
| 6/1/16 | 100.493 | 118.352 |
| 6/2/16 | 100.662 | 118.563 |
| 6/3/16 | 101.087 | 118.704 |
| 6/6/16 | 101.088 | 119.22 |
| 6/7/16 | 101.226 | 119.692 |
| 6/8/16 | 101.365 | 120.306 |
| 6/9/16 | 101.487 | 120.209 |
| 6/10/16 | 101.496 | 119.766 |
| 6/13/16 | 101.487 | 119.446 |
| 6/14/16 | 101.329 | 118.664 |
| 6/15/16 | 101.419 | 118.829 |
| 6/16/16 | 101.489 | 118.23 |
| 6/17/16 | 101.401 | 118.77 |
| 6/20/16 | 101.327 | 119.641 |
| 6/21/16 | 101.29 | 119.573 |
| 6/22/16 | 101.359 | 119.983 |
| 6/23/16 | 101.335 | 120.37 |
| 6/24/16 | 101.522 | 119.364 |
| 6/27/16 | 101.852 | 118.321 |
| 6/28/16 | 102.038 | 118.764 |
| 6/29/16 | 102.242 | 119.679 |
| 6/30/16 | 102.263 | 120.071 |
| 7/1/16 | 102.602 | 120.728 |
| 7/5/16 | 103.03 | 120.715 |
| 7/6/16 | 103.096 | 120.597 |
| 7/7/16 | 103.202 | 121.055 |
| 7/8/16 | 103.443 | 121.566 |
| 7/11/16 | 103.472 | 122.378 |
| 7/12/16 | 103.204 | 123.104 |
| 7/13/16 | 103.367 | 122.802 |
| 7/14/16 | 103.127 | 123.13 |
| 7/15/16 | 102.886 | 123.011 |
| 7/18/16 | 102.841 | 122.979 |
| 7/19/16 | 102.936 | 122.968 |
| 7/20/16 | 102.851 | 123.102 |
| 7/21/16 | 102.9 | 123.186 |
| 7/22/16 | 102.963 | 123.151 |
| 7/25/16 | 102.905 | 123.163 |
| 7/26/16 | 102.742 | 122.864 |
| 7/27/16 | 102.84 | 122.804 |
| 7/28/16 | 102.876 | 122.636 |
| 7/29/16 | 103.038 | 122.399 |
| 8/1/16 | 102.887 | 122.327 |
| 8/2/16 | 102.539 | 121.987 |
| 8/3/16 | 102.504 | 122.144 |
| 8/4/16 | 102.848 | 122.718 |
| 8/5/16 | 102.692 | 123.146 |
| 8/8/16 | 102.723 | 123.464 |
| 8/9/16 | 102.899 | 123.896 |
| 8/10/16 | 103.176 | 123.947 |
| 8/11/16 | 103.017 | 123.908 |
| 8/12/16 | 103.238 | 124.104 |
| 8/15/16 | 103.08 | 124.345 |
| 8/16/16 | 103.077 | 124.48 |
| 8/17/16 | 103.089 | 124.378 |
| 8/18/16 | 103.264 | 124.419 |
| 8/19/16 | 103.14 | 124.527 |
| 8/22/16 | 103.33 | 124.449 |
| 8/23/16 | 103.408 | 124.567 |
| 8/24/16 | 103.36 | 124.527 |
| 8/25/16 | 103.219 | 124.364 |
| 8/26/16 | 103.182 | 124.463 |
| 8/29/16 | 103.212 | 124.508 |
| 8/30/16 | 103.254 | 124.565 |
| 8/31/16 | 103.204 | 124.444 |
| 9/1/16 | 103.106 | 124.275 |
| 9/2/16 | 103.02 | 124.482 |
| 9/6/16 | 103.173 | 124.57 |
| 9/7/16 | 103.214 | 124.769 |
| 9/8/16 | 102.844 | 124.765 |
| 9/9/16 | 102.316 | 124.169 |
| 9/12/16 | 102.142 | 123.817 |
| 9/13/16 | 101.89 | 123.406 |
| 9/14/16 | 101.934 | 123.322 |
| 9/15/16 | 101.875 | 123.342 |
| 9/16/16 | 101.964 | 123.323 |
| 9/19/16 | 101.972 | 123.381 |
| 9/20/16 | 102.086 | 123.37 |
| 9/21/16 | 102.085 | 123.718 |
| 9/22/16 | 102.565 | 124.528 |
| 9/23/16 | 102.627 | 124.463 |
| 9/26/16 | 102.662 | 124.311 |
| 9/27/16 | 102.729 | 124.202 |
| 9/28/16 | 102.795 | 124.501 |
| 9/29/16 | 102.757 | 124.732 |
| 9/30/16 | 102.664 | 124.902 |
| 10/3/16 | 102.561 | 124.974 |
| 10/4/16 | 102.348 | 125.042 |
| 10/5/16 | 102.133 | 125.154 |
| 10/6/16 | 102.123 | 125.243 |
| 10/7/16 | 102.143 | 125.303 |
| 10/10/16 | 102.15 | 125.35 |
| 10/11/16 | 102.031 | 125.271 |
| 10/12/16 | 101.979 | 125.249 |
| 10/13/16 | 102.181 | 125.06 |
| 10/14/16 | 102.049 | 125.313 |
| 10/17/16 | 102.116 | 125.403 |
| 10/18/16 | 102.243 | 125.59 |
| 10/19/16 | 102.331 | 125.904 |
| 10/20/16 | 102.341 | 126.012 |
| 10/21/16 | 102.286 | 126.004 |
| 10/24/16 | 102.156 | 126.084 |
| 10/25/16 | 102.106 | 126.031 |
| 10/26/16 | 101.852 | 125.645 |
| 10/27/16 | 101.515 | 125.294 |
| 10/28/16 | 101.435 | 125.038 |
| 10/31/16 | 101.431 | 124.615 |
| 11/1/16 | 101.273 | 123.926 |
| 11/2/16 | 101.354 | 123.269 |
| 11/3/16 | 101.293 | 123.356 |
| 11/4/16 | 101.395 | 123.256 |
| 11/7/16 | 101.386 | 123.972 |
| 11/8/16 | 101.271 | 124.022 |
| 11/9/16 | 100.589 | 123.549 |
| 11/10/16 | 100.282 | 122.922 |
| 11/11/16 | 100.288 | 122.849 |
| 11/14/16 | 99.481 | 121.393 |
| 11/15/16 | 99.542 | 122.154 |
| 11/16/16 | 99.526 | 122.299 |
| 11/17/16 | 99.292 | 122.572 |
| 11/18/16 | 98.92 | 122.404 |
| 11/21/16 | 98.856 | 122.543 |
| 11/22/16 | 98.95 | 122.907 |
| 11/23/16 | 98.65 | 122.942 |
| 11/25/16 | 98.709 | 122.939 |
| 11/28/16 | 98.919 | 123.06 |
| 11/29/16 | 98.971 | 122.942 |
| 11/30/16 | 98.83 | 123.153 |
| 12/1/16 | 98.527 | 123.047 |
| 12/2/16 | 98.798 | 123.085 |
| 12/5/16 | 98.825 | 123.35 |
| 12/6/16 | 98.837 | 123.66 |
| 12/7/16 | 99.082 | 124.346 |
| 12/8/16 | 98.897 | 124.442 |
| 12/9/16 | 98.652 | 124.634 |
| 12/12/16 | 98.532 | 124.706 |
| 12/13/16 | 98.641 | 124.826 |
| 12/14/16 | 98.708 | 124.841 |
| 12/15/16 | 98.218 | 124.209 |
| 12/16/16 | 98.231 | 124.196 |
| 12/19/16 | 98.398 | 124.25 |
| 12/20/16 | 98.342 | 124.323 |
| 12/21/16 | 98.52 | 124.401 |
| 12/22/16 | 98.526 | 124.557 |
| 12/23/16 | 98.608 | 124.7 |
| 12/27/16 | 98.599 | 124.757 |
| 12/28/16 | 98.772 | 124.979 |
| 12/29/16 | 99.053 | 125.079 |
| 12/30/16 | 99.166 | 125.024 |
| 1/3/17 | 99.167 | 125.29 |
| 1/4/17 | 99.324 | 125.718 |
| 1/5/17 | 99.629 | 126.08 |
| 1/6/17 | 99.465 | 126.222 |
| 1/9/17 | 99.562 | 126.301 |
| 1/10/17 | 99.502 | 126.358 |
| 1/11/17 | 99.52 | 126.215 |
| 1/12/17 | 99.682 | 126.236 |
| 1/13/17 | 99.426 | 126.315 |
| 1/17/17 | 99.431 | 126.442 |
| 1/18/17 | 99.159 | 126.34 |
| 1/19/17 | 98.789 | 126.091 |
| 1/20/17 | 98.753 | 126.016 |
| 1/23/17 | 99.094 | 125.997 |
| 1/24/17 | 98.935 | 126.138 |
| 1/25/17 | 98.694 | 126.299 |
| 1/26/17 | 98.686 | 126.427 |
| 1/27/17 | 98.832 | 126.533 |
| 1/30/17 | 98.744 | 126.442 |
| 1/31/17 | 98.822 | 126.428 |
| 2/1/17 | 98.666 | 126.54 |
| 2/2/17 | 98.834 | 126.71 |
| 2/3/17 | 98.938 | 126.997 |
| 2/6/17 | 99.073 | 127.105 |
| 2/7/17 | 99.167 | 127.032 |
| 2/8/17 | 99.313 | 126.779 |
| 2/9/17 | 99.148 | 126.792 |
| 2/10/17 | 99.072 | 127.001 |
| 2/13/17 | 99.019 | 127.148 |
| 2/14/17 | 98.891 | 127.17 |
| 2/15/17 | 98.774 | 127.135 |
| 2/16/17 | 99.017 | 127.143 |
| 2/17/17 | 99.152 | 127.164 |
| 2/21/17 | 99.158 | 127.417 |
| 2/22/17 | 99.179 | 127.596 |
| 2/23/17 | 99.392 | 127.788 |
| 2/24/17 | 99.66 | 127.755 |
| 2/27/17 | 99.612 | 127.849 |
| 2/28/17 | 99.611 | 127.865 |
| 3/1/17 | 99.147 | 128.167 |
| 3/2/17 | 99.036 | 128.03 |
| 3/3/17 | 99.029 | 127.88 |
| 3/6/17 | 98.999 | 127.582 |
| 3/7/17 | 98.792 | 127.155 |
| 3/8/17 | 98.418 | 126.57 |
| 3/9/17 | 98.122 | 125.801 |
| 3/10/17 | 98.185 | 125.997 |
| 3/13/17 | 98.066 | 125.711 |
| 3/14/17 | 98.01 | 125.195 |
| 3/15/17 | 98.242 | 125.611 |
| 3/16/17 | 98.512 | 126.437 |
| 3/17/17 | 98.636 | 126.374 |
| 3/20/17 | 98.731 | 126.207 |
| 3/21/17 | 98.926 | 125.972 |
| 3/22/17 | 99.036 | 125.486 |
| 3/23/17 | 99.008 | 125.659 |
| 3/24/17 | 99.092 | 125.92 |
| 3/27/17 | 99.203 | 125.816 |
| 3/28/17 | 99.135 | 126.205 |
| 3/29/17 | 99.22 | 126.619 |
| 3/30/17 | 99.134 | 127.017 |
| 3/31/17 | 99.12 | 127.191 |
| 4/3/17 | 99.352 | 127.242 |
| 4/4/17 | 99.346 | 127.214 |
| 4/5/17 | 99.341 | 127.433 |
| 4/6/17 | 99.373 | 127.467 |
| 4/7/17 | 99.424 | 127.55 |
| 4/10/17 | 99.36 | 127.557 |
| 4/11/17 | 99.58 | 127.584 |
| 4/12/17 | 99.7 | 127.45 |
| 4/13/17 | 99.828 | 127.43 |
| 4/17/17 | 99.864 | 127.372 |
| 4/18/17 | 100.048 | 127.28 |
| 4/19/17 | 99.994 | 127.383 |
| 4/20/17 | 99.833 | 127.38 |
| 4/21/17 | 99.919 | 127.467 |
| 4/24/17 | 99.724 | 127.614 |
| 4/25/17 | 99.581 | 127.691 |
| 4/26/17 | 99.546 | 127.769 |
| 4/27/17 | 99.683 | 127.81 |
| 4/28/17 | 99.68 | 127.918 |
| 5/1/17 | 99.61 | 127.928 |
| 5/2/17 | 99.679 | 128.036 |
| 5/3/17 | 99.773 | 127.994 |
| 5/4/17 | 99.494 | 127.57 |
| 5/5/17 | 99.528 | 127.458 |
| 5/8/17 | 99.422 | 127.476 |
| 5/9/17 | 99.348 | 127.426 |
| 5/10/17 | 99.464 | 127.493 |
| 5/11/17 | 99.465 | 127.549 |
| 5/12/17 | 99.771 | 127.84 |
| 5/15/17 | 99.83 | 127.994 |
| 5/16/17 | 99.908 | 128.044 |
| 5/17/17 | 100.232 | 127.918 |
| 5/18/17 | 100.236 | 127.513 |
| 5/19/17 | 100.22 | 127.878 |
| 5/22/17 | 100.234 | 128.008 |
| 5/23/17 | 100.12 | 128.02 |
| 5/24/17 | 100.026 | 128.117 |
| 5/25/17 | 100.058 | 128.192 |
| 5/26/17 | 100.179 | 128.198 |
| 5/30/17 | 100.268 | 128.276 |
| 5/31/17 | 100.336 | 128.216 |
| 6/1/17 | 100.29 | 128.298 |
| 6/2/17 | 100.573 | 128.473 |
| 6/5/17 | 100.532 | 128.426 |
| 6/6/17 | 100.701 | 128.409 |
| 6/7/17 | 100.598 | 128.271 |
| 6/8/17 | 100.441 | 128.001 |
| 6/9/17 | 100.364 | 128.01 |
| 6/12/17 | 100.371 | 128.036 |
| 6/13/17 | 100.379 | 128.163 |
| 6/14/17 | 100.791 | 128.27 |
| 6/15/17 | 100.673 | 128.1 |
| 6/16/17 | 100.717 | 128.006 |
| 6/19/17 | 100.641 | 127.995 |
| 6/20/17 | 100.724 | 127.654 |
| 6/21/17 | 100.732 | 127.349 |
| 6/22/17 | 100.78 | 127.197 |
| 6/23/17 | 100.807 | 127.322 |
| 6/26/17 | 100.948 | 127.512 |
| 6/27/17 | 100.676 | 127.503 |
| 6/28/17 | 100.616 | 127.544 |
| 6/29/17 | 100.472 | 127.522 |
| 6/30/17 | 100.444 | 127.575 |
| 7/3/17 | 100.327 | 127.582 |
| 7/5/17 | 100.249 | 127.495 |
| 7/6/17 | 100.103 | 127.207 |
| 7/7/17 | 100.053 | 126.98 |
| 7/10/17 | 100.159 | 127.021 |
| 7/11/17 | 100.16 | 127.037 |
| 7/12/17 | 100.413 | 127.393 |
| 7/13/17 | 100.316 | 127.41 |
| 7/14/17 | 100.475 | 127.671 |
| 7/17/17 | 100.512 | 127.906 |
| 7/18/17 | 100.747 | 128.014 |
| 7/19/17 | 100.793 | 128.2 |
| 7/20/17 | 100.882 | 128.363 |
| 7/21/17 | 101.003 | 128.319 |
| 7/24/17 | 100.907 | 128.32 |
| 7/25/17 | 100.593 | 128.264 |
| 7/26/17 | 100.617 | 128.423 |
| 7/27/17 | 100.612 | 128.402 |
| 7/28/17 | 100.698 | 128.427 |
| 7/31/17 | 100.712 | 128.375 |
| 8/1/17 | 100.858 | 128.429 |
| 8/2/17 | 100.869 | 128.446 |
| 8/3/17 | 100.91 | 128.372 |
| 8/4/17 | 100.719 | 128.226 |
| 8/7/17 | 100.69 | 128.247 |
| 8/8/17 | 100.529 | 128.057 |
| 8/9/17 | 100.501 | 127.577 |
| 8/10/17 | 100.444 | 127.161 |
| 8/11/17 | 100.428 | 127.045 |
| 8/14/17 | 100.51 | 127.316 |
| 8/15/17 | 100.408 | 127.277 |
| 8/16/17 | 100.511 | 127.325 |
| 8/17/17 | 100.625 | 127.225 |
| 8/18/17 | 100.649 | 126.998 |
| 8/21/17 | 100.662 | 127.05 |
| 8/22/17 | 100.58 | 127.155 |
| 8/23/17 | 100.707 | 127.154 |
| 8/24/17 | 100.702 | 127.322 |
| 8/25/17 | 100.766 | 127.444 |
| 8/28/17 | 100.811 | 127.519 |
| 8/29/17 | 100.91 | 127.551 |
| 8/30/17 | 100.866 | 127.652 |
| 8/31/17 | 100.955 | 127.923 |
| 9/1/17 | 100.918 | 128.046 |
| 9/5/17 | 101.116 | 128.11 |
| 9/6/17 | 101.064 | 128.114 |
| 9/7/17 | 101.148 | 128.098 |
| 9/8/17 | 101.061 | 127.96 |
| 9/11/17 | 100.823 | 127.908 |
| 9/12/17 | 100.676 | 127.893 |
| 9/13/17 | 100.664 | 127.977 |
| 9/14/17 | 100.655 | 128.006 |
| 9/15/17 | 100.738 | 128.012 |
| 9/18/17 | 100.691 | 128.097 |
| 9/19/17 | 100.71 | 128.152 |
| 9/20/17 | 100.669 | 128.143 |
| 9/21/17 | 100.604 | 128.023 |
| 9/22/17 | 100.65 | 128.083 |
| 9/25/17 | 100.805 | 128.129 |
| 9/26/17 | 100.807 | 128.234 |
| 9/27/17 | 100.562 | 128.132 |
| 9/28/17 | 100.593 | 128.209 |
| 9/29/17 | 100.721 | 128.376 |
| 10/2/17 | 100.746 | 128.389 |
| 10/3/17 | 100.834 | 128.512 |
| 10/4/17 | 100.794 | 128.503 |
| 10/5/17 | 100.73 | 128.568 |
| 10/6/17 | 100.629 | 128.471 |
| 10/9/17 | 100.645 | 128.493 |
| 10/10/17 | 100.736 | 128.533 |
| 10/11/17 | 100.693 | 128.507 |
| 10/12/17 | 100.668 | 128.408 |
| 10/13/17 | 100.881 | 128.399 |
| 10/16/17 | 100.84 | 128.461 |
| 10/17/17 | 100.795 | 128.526 |
| 10/18/17 | 100.661 | 128.534 |
| 10/19/17 | 100.761 | 128.61 |
| 10/20/17 | 100.579 | 128.587 |
| 10/23/17 | 100.646 | 128.657 |
| 10/24/17 | 100.499 | 128.553 |
| 10/25/17 | 100.282 | 128.267 |
| 10/26/17 | 100.274 | 128.238 |
| 10/27/17 | 100.354 | 128.165 |
| 10/30/17 | 100.557 | 128.146 |
| 10/31/17 | 100.509 | 128.181 |
| 11/1/17 | 100.558 | 128.202 |
| 11/2/17 | 100.534 | 128.091 |
| 11/3/17 | 100.544 | 128.096 |
| 11/6/17 | 100.546 | 127.944 |
| 11/7/17 | 100.462 | 127.761 |
| 11/8/17 | 100.402 | 127.309 |
| 11/9/17 | 100.215 | 126.763 |
| 11/10/17 | 99.868 | 126.665 |
| 11/13/17 | 99.862 | 126.59 |
| 11/14/17 | 99.872 | 126.281 |
| 11/15/17 | 99.956 | 125.912 |
| 11/16/17 | 99.994 | 126.616 |
| 11/17/17 | 100.092 | 126.74 |
| 11/20/17 | 100.053 | 126.791 |
| 11/21/17 | 100.208 | 126.93 |
| 11/22/17 | 100.355 | 127.049 |
| 11/24/17 | 100.398 | 127.165 |
| 11/27/17 | 100.38 | 127.179 |
| 11/28/17 | 100.434 | 127.171 |
| 11/29/17 | 100.207 | 127.16 |
| 11/30/17 | 100.115 | 127.119 |
| 12/1/17 | 100.319 | 127.199 |
| 12/4/17 | 100.297 | 127.193 |
| 12/5/17 | 100.413 | 127.273 |
| 12/6/17 | 100.604 | 127.188 |
| 12/7/17 | 100.463 | 127.047 |
| 12/8/17 | 100.326 | 126.989 |
| 12/11/17 | 100.36 | 126.978 |
| 12/12/17 | 100.255 | 127.021 |
| 12/13/17 | 100.446 | 127.08 |
| 12/14/17 | 100.569 | 127.054 |
| 12/15/17 | 100.606 | 127 |
| 12/18/17 | 100.509 | 126.871 |
| 12/19/17 | 100.19 | 126.797 |
| 12/20/17 | 99.99 | 126.652 |
| 12/21/17 | 100.044 | 126.725 |
| 12/22/17 | 100.072 | 126.741 |
| 12/26/17 | 100.134 | 126.789 |
| 12/27/17 | 100.395 | 126.782 |
| 12/28/17 | 100.493 | 126.924 |
| 12/29/17 | 100.537 | 126.974 |
| 1/1/18 | 100.537 | 126.974 |
| 1/2/18 | 100.218 | 126.984 |
| 1/3/18 | 100.268 | 127.319 |
| 1/4/18 | 100.188 | 127.603 |
| 1/5/18 | 100.176 | 127.707 |
| 1/8/18 | 100.175 | 127.753 |
| 1/9/18 | 99.997 | 127.66 |
| 1/10/18 | 99.876 | 127.356 |
| 1/11/18 | 100.024 | 127.529 |
| 1/12/18 | 100.019 | 127.554 |
| 1/15/18 | 100.019 | 127.554 |
| 1/16/18 | 100.114 | 127.649 |
| 1/17/18 | 99.954 | 127.559 |
| 1/18/18 | 99.711 | 127.378 |
| 1/19/18 | 99.521 | 127.254 |
| 1/22/18 | 99.421 | 127.293 |
| 1/23/18 | 99.569 | 127.385 |
| 1/24/18 | 99.475 | 127.518 |
| 1/25/18 | 99.663 | 127.666 |
| 1/26/18 | 99.667 | 127.674 |
| 1/29/18 | 99.521 | 127.386 |
| 1/30/18 | 99.357 | 127.055 |
| 1/31/18 | 99.406 | 127.186 |
| 2/1/18 | 99.331 | 127.002 |
| 2/2/18 | 98.946 | 126.474 |
| 2/5/18 | 98.848 | 126.072 |
| 2/6/18 | 98.866 | 125.608 |
| 2/7/18 | 98.778 | 125.949 |
| 2/8/18 | 98.402 | 125.264 |
| 2/9/18 | 98.137 | 124.312 |
| 2/12/18 | 98.076 | 124.558 |
| 2/13/18 | 97.881 | 124.308 |
| 2/14/18 | 97.742 | 124.16 |
| 2/15/18 | 97.923 | 124.893 |
| 2/16/18 | 98.076 | 125.398 |
| 2/19/18 | 98.076 | 125.398 |
| 2/20/18 | 97.854 | 125.264 |
| 2/21/18 | 97.764 | 125.204 |
| 2/22/18 | 97.701 | 124.966 |
| 2/23/18 | 97.817 | 124.998 |
| 2/26/18 | 97.984 | 125.373 |
| 2/27/18 | 97.73 | 125.297 |
| 2/28/18 | 97.712 | 125.253 |
| 3/1/18 | 97.674 | 124.982 |
| 3/2/18 | 97.518 | 124.511 |
| 3/5/18 | 97.523 | 124.718 |
| 3/6/18 | 97.619 | 124.991 |
| 3/7/18 | 97.553 | 124.896 |
| 3/8/18 | 97.574 | 124.874 |
| 3/9/18 | 97.381 | 124.877 |
| 3/12/18 | 97.342 | 124.746 |
| 3/13/18 | 97.388 | 124.743 |
| 3/14/18 | 97.487 | 124.609 |
| 3/15/18 | 97.449 | 124.523 |
| 3/16/18 | 97.465 | 124.528 |
| 3/19/18 | 97.363 | 124.329 |
| 3/20/18 | 97.144 | 124.215 |
| 3/21/18 | 96.973 | 124.166 |
| 3/22/18 | 97.144 | 124.042 |
| 3/23/18 | 97.058 | 123.905 |
| 3/26/18 | 97.096 | 123.879 |
| 3/27/18 | 97.323 | 124.056 |
| 3/28/18 | 97.472 | 123.988 |
| 3/29/18 | 97.665 | 124.127 |
| 3/30/18 | 97.665 | 124.127 |
| 4/2/18 | 97.687 | 123.974 |
| 4/3/18 | 97.572 | 123.977 |
| 4/4/18 | 97.575 | 123.957 |
| 4/5/18 | 97.518 | 124.356 |
| 4/6/18 | 97.683 | 124.435 |
| 4/9/18 | 97.734 | 124.477 |
| 4/10/18 | 97.76 | 124.791 |
| 4/11/18 | 97.828 | 124.906 |
| 4/12/18 | 97.697 | 125.091 |
| 4/13/18 | 97.666 | 125.211 |
| 4/16/18 | 97.601 | 125.337 |
| 4/17/18 | 97.666 | 125.504 |
| 4/18/18 | 97.456 | 125.452 |
| 4/19/18 | 97.066 | 125.011 |
| 4/20/18 | 96.908 | 124.777 |
| 4/23/18 | 96.74 | 124.502 |
| 4/24/18 | 96.646 | 124.326 |
| 4/25/18 | 96.397 | 123.893 |
| 4/26/18 | 96.524 | 124.153 |
| 4/27/18 | 96.634 | 124.181 |
| 4/30/18 | 96.654 | 124.142 |
| 5/1/18 | 96.458 | 123.908 |
| 5/2/18 | 96.409 | 123.972 |
| 5/3/18 | 96.486 | 123.865 |
| 5/4/18 | 96.403 | 123.816 |
| 5/7/18 | 96.41 | 123.999 |
| 5/8/18 | 96.298 | 123.798 |
| 5/9/18 | 96.299 | 123.794 |
| 5/10/18 | 96.499 | 124.084 |
| 5/11/18 | 96.636 | 124.22 |
| 5/14/18 | 96.601 | 124.237 |
| 5/15/18 | 96.133 | 123.896 |
| 5/16/18 | 96.064 | 123.826 |
| 5/17/18 | 95.938 | 123.717 |
| 5/18/18 | 96.03 | 123.604 |
| 5/21/18 | 96.075 | 123.679 |
| 5/22/18 | 96.076 | 123.714 |
| 5/23/18 | 96.278 | 123.683 |
| 5/24/18 | 96.467 | 123.644 |
| 5/25/18 | 96.627 | 123.662 |
| 5/28/18 | 96.627 | 123.662 |
| 5/29/18 | 96.916 | 123.432 |
| 5/30/18 | 96.788 | 123.45 |
| 5/31/18 | 96.814 | 123.608 |
| 6/1/18 | 96.622 | 123.474 |
| 6/4/18 | 96.503 | 123.569 |
| 6/5/18 | 96.488 | 123.644 |
| 6/6/18 | 96.205 | 123.591 |
| 6/7/18 | 96.286 | 123.608 |
| 6/8/18 | 96.32 | 123.582 |
| 6/11/18 | 96.176 | 123.629 |
| 6/12/18 | 96.167 | 123.656 |
| 6/13/18 | 96.185 | 123.833 |
| 6/14/18 | 96.317 | 123.932 |
| 6/15/18 | 96.397 | 123.923 |
| 6/18/18 | 96.234 | 123.831 |
| 6/19/18 | 96.253 | 123.647 |
| 6/20/18 | 96.068 | 123.81 |
| 6/21/18 | 95.883 | 123.67 |
| 6/22/18 | 95.926 | 123.729 |
| 6/25/18 | 95.944 | 123.54 |
| 6/26/18 | 95.99 | 123.454 |
| 6/27/18 | 96.23 | 123.478 |
| 6/28/18 | 96.166 | 123.024 |
| 6/29/18 | 96.26 | 123.138 |
| 7/2/18 | 96.172 | 122.778 |
| 7/3/18 | 96.313 | 122.97 |
| 7/4/18 | 96.313 | 122.97 |
| 7/5/18 | 96.494 | 123.121 |
| 7/6/18 | 96.619 | 123.25 |
| 7/9/18 | 96.626 | 123.479 |
| 7/10/18 | 96.643 | 123.639 |
| 7/11/18 | 96.673 | 123.554 |
| 7/12/18 | 96.762 | 123.673 |
| 7/13/18 | 96.887 | 123.787 |
| 7/16/18 | 96.789 | 123.757 |
| 7/17/18 | 96.741 | 123.697 |
| 7/18/18 | 96.711 | 123.732 |
| 7/19/18 | 96.784 | 123.717 |
| 7/20/18 | 96.659 | 123.74 |
| 7/23/18 | 96.408 | 123.68 |
| 7/24/18 | 96.51 | 123.779 |
| 7/25/18 | 96.604 | 123.867 |
| 7/26/18 | 96.622 | 124.058 |
| 7/27/18 | 96.71 | 124.114 |
| 7/30/18 | 96.628 | 124.055 |
| 7/31/18 | 96.734 | 124.241 |
| 8/1/18 | 96.55 | 124.151 |
| 8/2/18 | 96.568 | 124.196 |
| 8/3/18 | 96.77 | 124.388 |
| 8/6/18 | 96.914 | 124.467 |
| 8/7/18 | 96.756 | 124.529 |
| 8/8/18 | 96.618 | 124.456 |
| 8/9/18 | 96.662 | 124.354 |
| 8/10/18 | 96.722 | 124.139 |
| 8/13/18 | 96.688 | 123.977 |
| 8/14/18 | 96.747 | 124.064 |
| 8/15/18 | 96.858 | 123.967 |
| 8/16/18 | 96.892 | 124.08 |
| 8/17/18 | 96.975 | 124.142 |
| 8/20/18 | 97.131 | 124.262 |
| 8/21/18 | 97.034 | 124.325 |
| 8/22/18 | 97.03 | 124.341 |
| 8/23/18 | 97.03 | 124.291 |
| 8/24/18 | 97.01 | 124.3 |
| 8/27/18 | 96.97 | 124.332 |
| 8/28/18 | 96.837 | 124.338 |
| 8/29/18 | 96.748 | 124.268 |
| 8/30/18 | 96.772 | 124.191 |
| 8/31/18 | 96.793 | 124.142 |
| 9/3/18 | 96.793 | 124.142 |
| 9/4/18 | 96.501 | 123.94 |
| 9/5/18 | 96.504 | 123.836 |
| 9/6/18 | 96.67 | 123.913 |
| 9/7/18 | 96.443 | 123.873 |
| 9/10/18 | 96.502 | 123.873 |
| 9/11/18 | 96.38 | 123.891 |
| 9/12/18 | 96.5 | 123.983 |
| 9/13/18 | 96.585 | 124.144 |
| 9/14/18 | 96.507 | 124.156 |
| 9/17/18 | 96.48 | 124.18 |
| 9/18/18 | 96.265 | 124.176 |
| 9/19/18 | 96.12 | 124.03 |
| 9/20/18 | 96.264 | 124.051 |
| 9/21/18 | 96.28 | 124.092 |
| 9/24/18 | 96.179 | 124.045 |
| 9/25/18 | 96.096 | 123.937 |
| 9/26/18 | 96.225 | 124.043 |
| 9/27/18 | 96.341 | 124.163 |
| 9/28/18 | 96.402 | 124.215 |
| 10/1/18 | 96.317 | 124.334 |
| 10/2/18 | 96.369 | 124.39 |
| 10/3/18 | 96.016 | 124.315 |
| 10/4/18 | 95.705 | 123.711 |
| 10/5/18 | 95.514 | 123.468 |
| 10/8/18 | 95.545 | 123.505 |
| 10/9/18 | 95.478 | 123.112 |
| 10/10/18 | 95.343 | 122.696 |
| 10/11/18 | 95.539 | 122.657 |
| 10/12/18 | 95.567 | 122.94 |
| 10/15/18 | 95.479 | 122.906 |
| 10/16/18 | 95.494 | 123.137 |
| 10/17/18 | 95.435 | 123.065 |
| 10/18/18 | 95.291 | 122.803 |
| 10/19/18 | 95.19 | 122.692 |
| 10/22/18 | 95.146 | 122.594 |
| 10/23/18 | 95.139 | 122.174 |
| 10/24/18 | 95.237 | 122.22 |
| 10/25/18 | 95.12 | 121.992 |
| 10/26/18 | 95.239 | 121.752 |
| 10/29/18 | 95.152 | 121.713 |
| 10/30/18 | 94.969 | 121.42 |
| 10/31/18 | 94.835 | 121.757 |